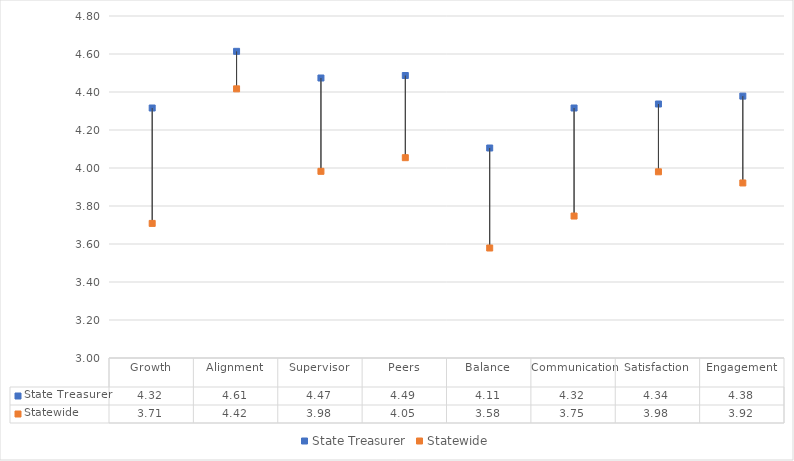
| Category | State Treasurer | Statewide |
|---|---|---|
| Growth | 4.316 | 3.708 |
| Alignment | 4.614 | 4.417 |
| Supervisor | 4.474 | 3.983 |
| Peers | 4.487 | 4.054 |
| Balance | 4.105 | 3.579 |
| Communication | 4.316 | 3.747 |
| Satisfaction | 4.337 | 3.98 |
| Engagement | 4.378 | 3.921 |